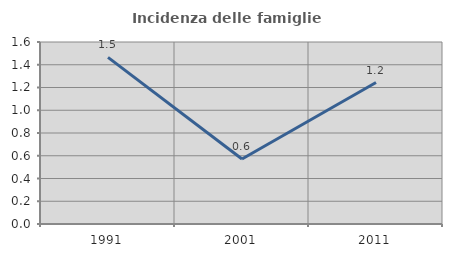
| Category | Incidenza delle famiglie numerose |
|---|---|
| 1991.0 | 1.464 |
| 2001.0 | 0.571 |
| 2011.0 | 1.243 |